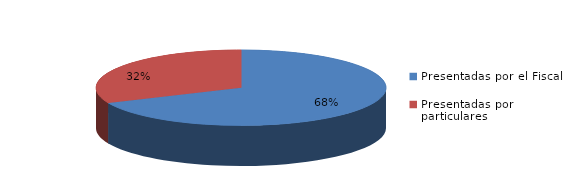
| Category | Series 0 |
|---|---|
| Presentadas por el Fiscal | 240 |
| Presentadas por particulares | 111 |